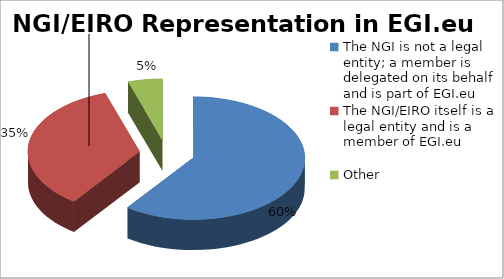
| Category | Series 0 |
|---|---|
| The NGI is not a legal entity; a member is delegated on its behalf and is part of EGI.eu | 12 |
| The NGI/EIRO itself is a legal entity and is a member of EGI.eu | 7 |
| Other | 1 |